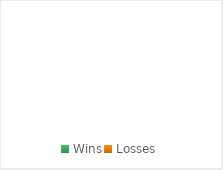
| Category | % |
|---|---|
| Wins | 0 |
| Losses | 0 |